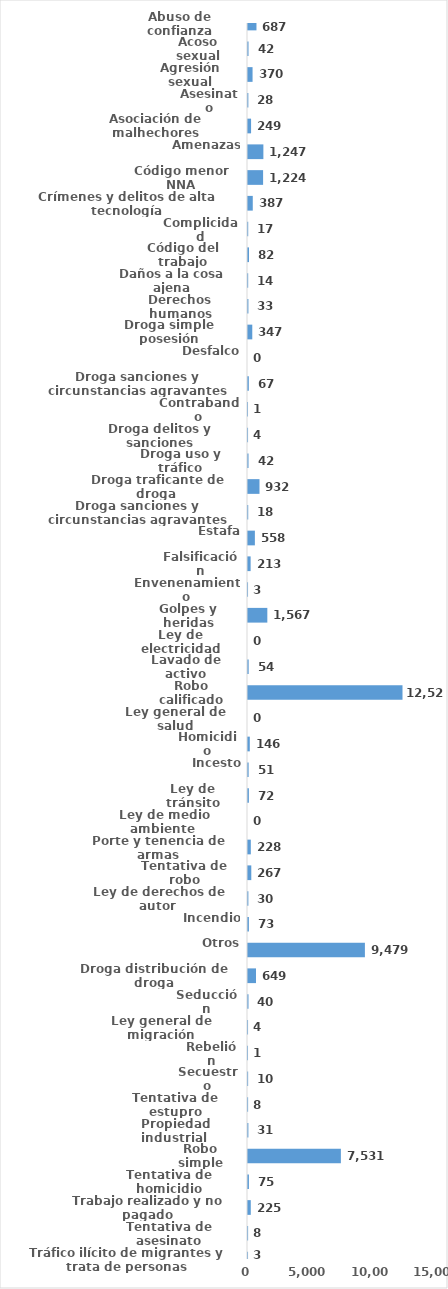
| Category | Series 0 |
|---|---|
| Abuso de confianza | 687 |
| Acoso sexual | 42 |
| Agresión sexual | 370 |
| Asesinato | 28 |
| Asociación de malhechores | 249 |
| Amenazas | 1247 |
| Código menor NNA | 1224 |
| Crímenes y delitos de alta tecnología | 387 |
| Complicidad | 17 |
| Código del trabajo | 82 |
| Daños a la cosa ajena | 14 |
| Derechos humanos | 33 |
| Droga simple posesión | 347 |
| Desfalco | 0 |
| Droga sanciones y circunstancias agravantes | 67 |
| Contrabando | 1 |
| Droga delitos y sanciones | 4 |
| Droga uso y tráfico | 42 |
| Droga traficante de droga  | 932 |
| Droga sanciones y circunstancias agravantes | 18 |
| Estafa | 558 |
| Falsificación | 213 |
| Envenenamiento | 3 |
| Golpes y heridas | 1567 |
| Ley de electricidad | 0 |
| Lavado de activo | 54 |
| Robo calificado | 12527 |
| Ley general de salud | 0 |
| Homicidio | 146 |
| Incesto | 51 |
| Ley de tránsito | 72 |
| Ley de medio ambiente  | 0 |
| Porte y tenencia de armas | 228 |
| Tentativa de robo | 267 |
| Ley de derechos de autor  | 30 |
| Incendio | 73 |
| Otros | 9479 |
| Droga distribución de droga | 649 |
| Seducción | 40 |
| Ley general de migración | 4 |
| Rebelión | 1 |
| Secuestro | 10 |
| Tentativa de estupro | 8 |
| Propiedad industrial  | 31 |
| Robo simple | 7531 |
| Tentativa de homicidio | 75 |
| Trabajo realizado y no pagado | 225 |
| Tentativa de asesinato | 8 |
| Tráfico ilícito de migrantes y trata de personas | 3 |